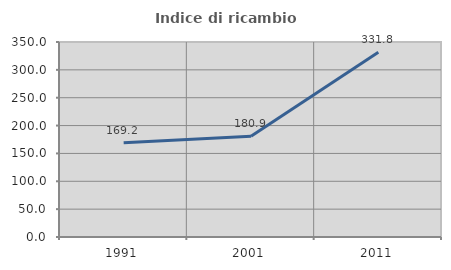
| Category | Indice di ricambio occupazionale  |
|---|---|
| 1991.0 | 169.231 |
| 2001.0 | 180.929 |
| 2011.0 | 331.787 |